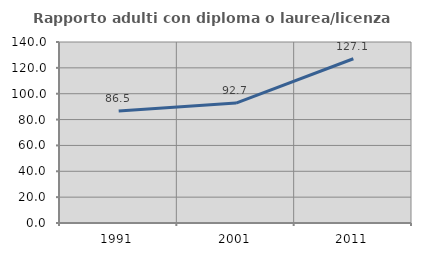
| Category | Rapporto adulti con diploma o laurea/licenza media  |
|---|---|
| 1991.0 | 86.545 |
| 2001.0 | 92.727 |
| 2011.0 | 127.057 |